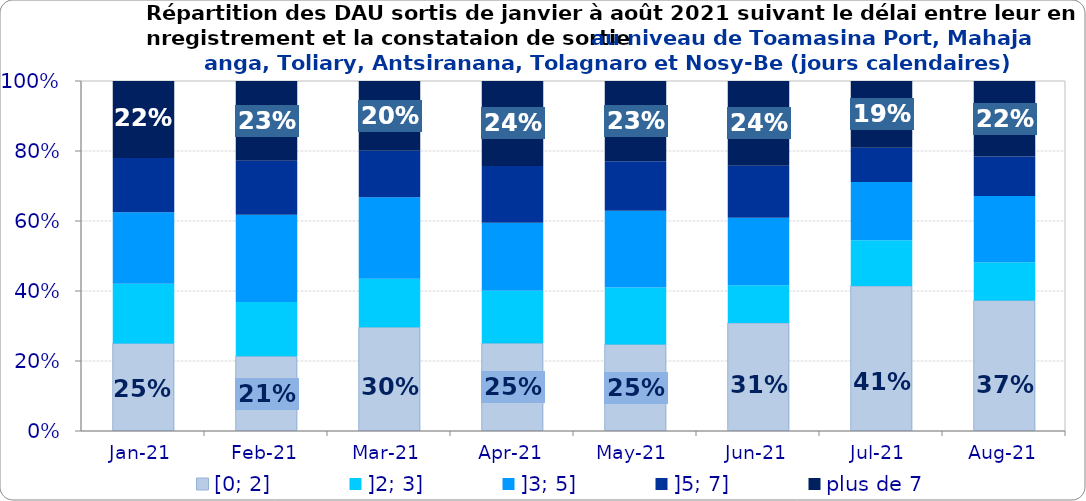
| Category | [0; 2] | ]2; 3] | ]3; 5] | ]5; 7] | plus de 7 |
|---|---|---|---|---|---|
| 2021-01-01 | 0.25 | 0.17 | 0.204 | 0.155 | 0.22 |
| 2021-02-01 | 0.213 | 0.155 | 0.249 | 0.155 | 0.228 |
| 2021-03-01 | 0.296 | 0.139 | 0.233 | 0.133 | 0.199 |
| 2021-04-01 | 0.25 | 0.151 | 0.194 | 0.162 | 0.243 |
| 2021-05-01 | 0.247 | 0.163 | 0.219 | 0.141 | 0.23 |
| 2021-06-01 | 0.308 | 0.108 | 0.193 | 0.149 | 0.242 |
| 2021-07-01 | 0.414 | 0.131 | 0.166 | 0.098 | 0.191 |
| 2021-08-01 | 0.373 | 0.11 | 0.189 | 0.112 | 0.216 |